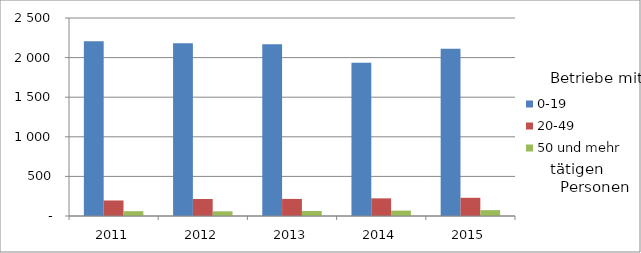
| Category | 0-19 | 20-49 | 50 und mehr |
|---|---|---|---|
| 2011.0 | 2206 | 196 | 61 |
| 2012.0 | 2181 | 215 | 59 |
| 2013.0 | 2169 | 216 | 63 |
| 2014.0 | 1936 | 223 | 68 |
| 2015.0 | 2111 | 230 | 74 |